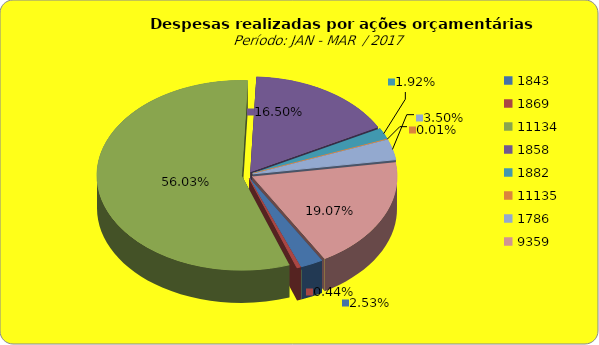
| Category | Series 1 |
|---|---|
| 1843.0 | 1886743.55 |
| 1869.0 | 327428.74 |
| 11134.0 | 41755585.83 |
| 1858.0 | 12296664.14 |
| 1882.0 | 1433469.61 |
| 11135.0 | 9311 |
| 1786.0 | 2604832.56 |
| 9359.0 | 14210828.05 |